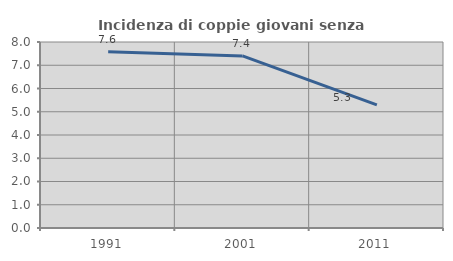
| Category | Incidenza di coppie giovani senza figli |
|---|---|
| 1991.0 | 7.577 |
| 2001.0 | 7.401 |
| 2011.0 | 5.299 |